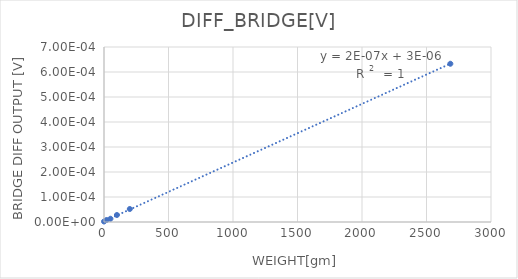
| Category | DIFF_BRIDGE[V] |
|---|---|
| 0.0 | 0 |
| 20.0 | 0 |
| 50.0 | 0 |
| 100.0 | 0 |
| 200.0 | 0 |
| 2685.0 | 0.001 |